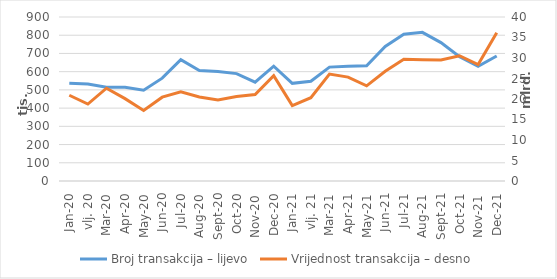
| Category | Broj transakcija – lijevo |
|---|---|
| sij.20 | 536477 |
| vlj. 20 | 531850 |
| ožu.20 | 513951 |
| tra.20 | 514502 |
| svi.20 | 498228 |
| lip.20 | 564271 |
| srp.20 | 665655 |
| kol.20 | 605764 |
| ruj.20 | 600772 |
| lis.20 | 589410 |
| stu.20 | 542127 |
| pro.20 | 629802 |
| sij.21 | 535895 |
| vlj. 21 | 547629 |
| ožu.21 | 625030 |
| tra.21 | 630059 |
| svi.21 | 632830 |
| lip.21 | 738379 |
| srp.21 | 805498 |
| kol.21 | 815683 |
| ruj.21 | 759367 |
| lis.21 | 682361 |
| stu.21 | 629062 |
| pro.21 | 685636 |